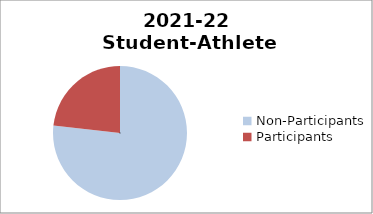
| Category | 2015-16 Student-Athlete Participation (Female) |
|---|---|
| Non-Participants | 928 |
| Participants | 281 |